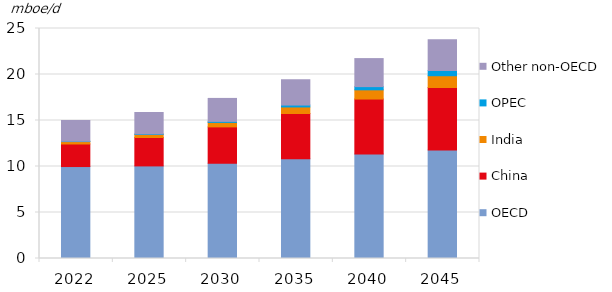
| Category | OECD | China | India | OPEC | Other non-OECD |
|---|---|---|---|---|---|
| 2022.0 | 9.995 | 2.452 | 0.263 | 0.04 | 2.253 |
| 2025.0 | 10.064 | 3.089 | 0.331 | 0.061 | 2.327 |
| 2030.0 | 10.363 | 3.942 | 0.486 | 0.112 | 2.497 |
| 2035.0 | 10.846 | 4.913 | 0.714 | 0.207 | 2.749 |
| 2040.0 | 11.355 | 5.977 | 1.002 | 0.349 | 3.047 |
| 2045.0 | 11.794 | 6.794 | 1.278 | 0.561 | 3.353 |